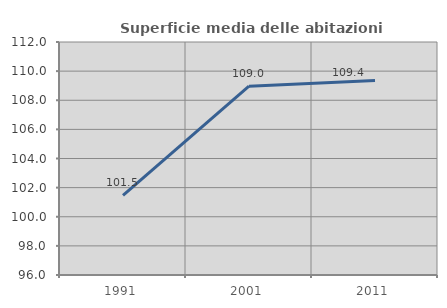
| Category | Superficie media delle abitazioni occupate |
|---|---|
| 1991.0 | 101.462 |
| 2001.0 | 108.965 |
| 2011.0 | 109.363 |